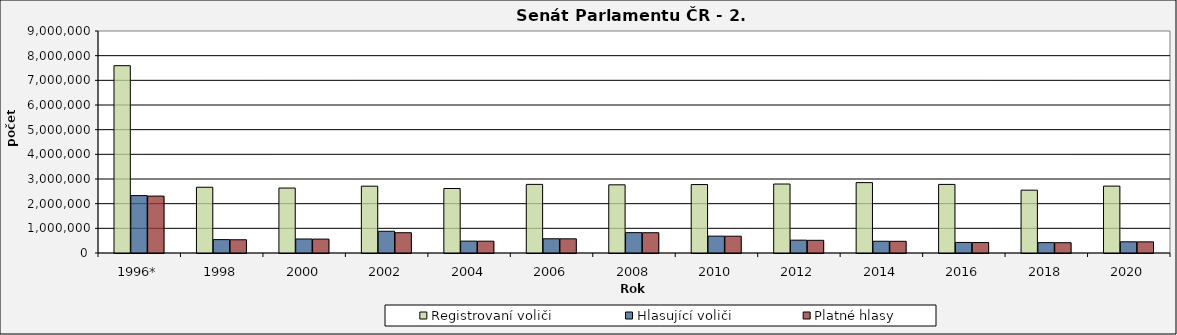
| Category | Registrovaní voliči | Hlasující voliči | Platné hlasy |
|---|---|---|---|
| 1996* | 7594316 | 2326464 | 2307259 |
| 1998 | 2665043 | 542660 | 537091 |
| 2000 | 2633794 | 567872 | 563524 |
| 2002 | 2708764 | 881693 | 822287 |
| 2004 | 2614630 | 481475 | 478891 |
| 2006 | 2781827 | 576630 | 574555 |
| 2008 | 2764218 | 825126 | 822353 |
| 2010 | 2774982 | 683705 | 680437 |
| 2012 | 2796196 | 520216 | 514092 |
| 2014 | 2853618 | 476334 | 473926 |
| 2016 | 2780597 | 427774 | 424089 |
| 2018 | 2547488 | 420118 | 417772 |
| 2020 | 2711956 | 453855 | 451863 |